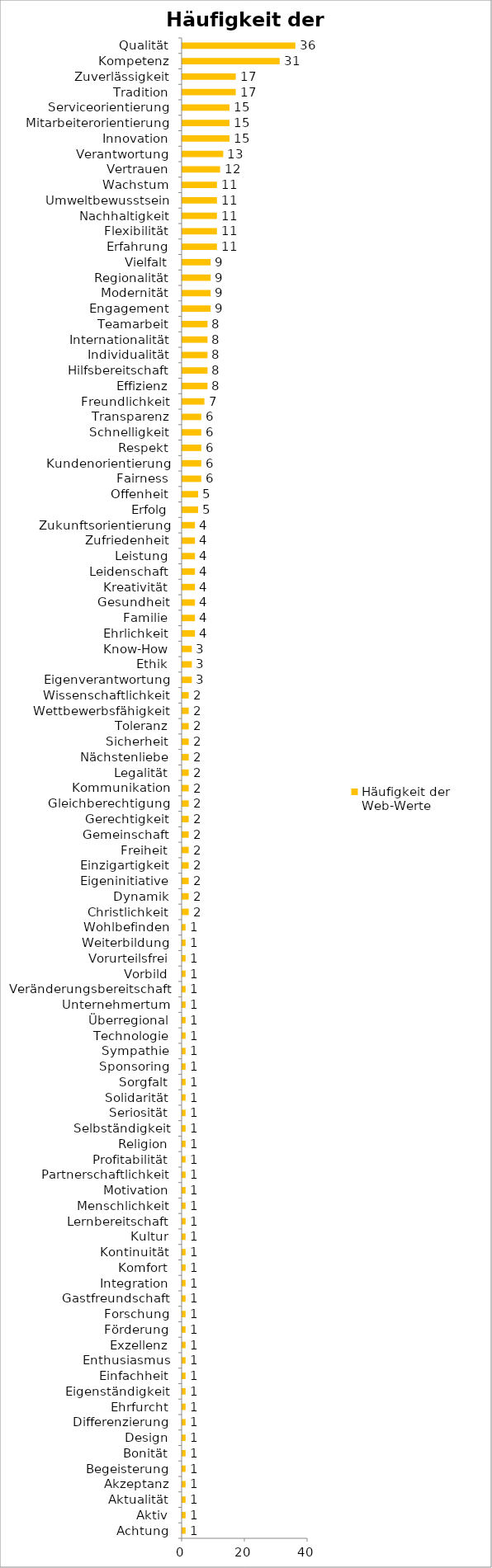
| Category | Häufigkeit der Web-Werte |
|---|---|
| Achtung | 1 |
| Aktiv | 1 |
| Aktualität | 1 |
| Akzeptanz | 1 |
| Begeisterung | 1 |
| Bonität | 1 |
| Design | 1 |
| Differenzierung | 1 |
| Ehrfurcht | 1 |
| Eigenständigkeit | 1 |
| Einfachheit | 1 |
| Enthusiasmus | 1 |
| Exzellenz | 1 |
| Förderung | 1 |
| Forschung | 1 |
| Gastfreundschaft | 1 |
| Integration | 1 |
| Komfort | 1 |
| Kontinuität | 1 |
| Kultur | 1 |
| Lernbereitschaft | 1 |
| Menschlichkeit | 1 |
| Motivation | 1 |
| Partnerschaftlichkeit | 1 |
| Profitabilität | 1 |
| Religion | 1 |
| Selbständigkeit | 1 |
| Seriosität | 1 |
| Solidarität | 1 |
| Sorgfalt | 1 |
| Sponsoring | 1 |
| Sympathie | 1 |
| Technologie | 1 |
| Überregional | 1 |
| Unternehmertum | 1 |
| Veränderungsbereitschaft | 1 |
| Vorbild | 1 |
| Vorurteilsfrei | 1 |
| Weiterbildung | 1 |
| Wohlbefinden | 1 |
| Christlichkeit | 2 |
| Dynamik | 2 |
| Eigeninitiative | 2 |
| Einzigartigkeit | 2 |
| Freiheit | 2 |
| Gemeinschaft | 2 |
| Gerechtigkeit | 2 |
| Gleichberechtigung | 2 |
| Kommunikation | 2 |
| Legalität | 2 |
| Nächstenliebe | 2 |
| Sicherheit | 2 |
| Toleranz | 2 |
| Wettbewerbsfähigkeit | 2 |
| Wissenschaftlichkeit | 2 |
| Eigenverantwortung | 3 |
| Ethik | 3 |
| Know-How | 3 |
| Ehrlichkeit | 4 |
| Familie | 4 |
| Gesundheit | 4 |
| Kreativität | 4 |
| Leidenschaft | 4 |
| Leistung | 4 |
| Zufriedenheit | 4 |
| Zukunftsorientierung | 4 |
| Erfolg | 5 |
| Offenheit | 5 |
| Fairness | 6 |
| Kundenorientierung | 6 |
| Respekt | 6 |
| Schnelligkeit | 6 |
| Transparenz | 6 |
| Freundlichkeit | 7 |
| Effizienz | 8 |
| Hilfsbereitschaft | 8 |
| Individualität | 8 |
| Internationalität | 8 |
| Teamarbeit | 8 |
| Engagement | 9 |
| Modernität | 9 |
| Regionalität | 9 |
| Vielfalt | 9 |
| Erfahrung | 11 |
| Flexibilität | 11 |
| Nachhaltigkeit | 11 |
| Umweltbewusstsein | 11 |
| Wachstum | 11 |
| Vertrauen | 12 |
| Verantwortung | 13 |
| Innovation | 15 |
| Mitarbeiterorientierung | 15 |
| Serviceorientierung | 15 |
| Tradition | 17 |
| Zuverlässigkeit | 17 |
| Kompetenz | 31 |
| Qualität | 36 |